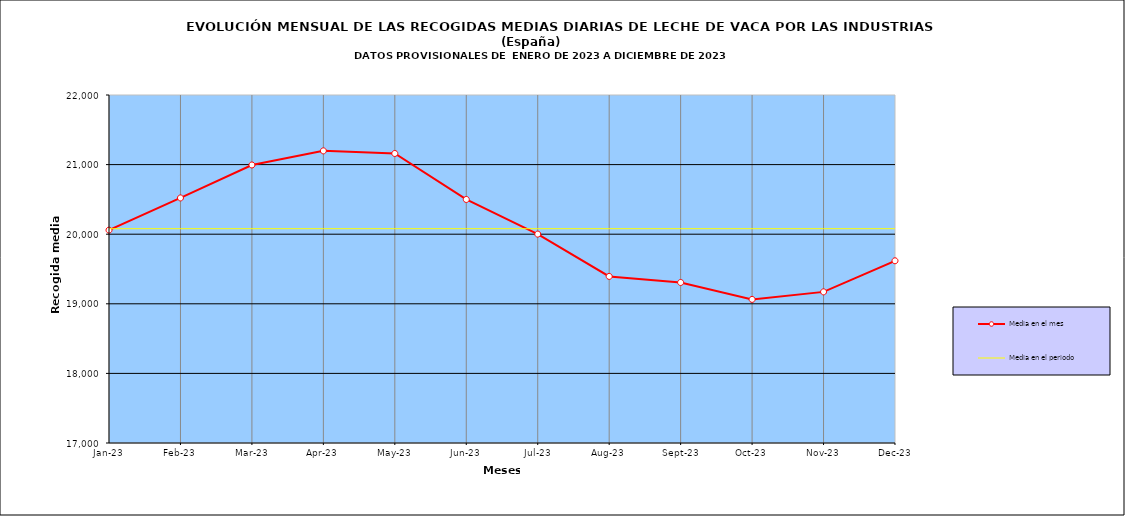
| Category | Media en el mes | Media en el periodo |
|---|---|---|
| 2023-01-01 | 20058.355 | 20078.822 |
| 2023-02-01 | 20521 | 20078.822 |
| 2023-03-01 | 20994.613 | 20078.822 |
| 2023-04-01 | 21197.267 | 20078.822 |
| 2023-05-01 | 21159.71 | 20078.822 |
| 2023-06-01 | 20499.167 | 20078.822 |
| 2023-07-01 | 20001.387 | 20078.822 |
| 2023-08-01 | 19393.581 | 20078.822 |
| 2023-09-01 | 19306.433 | 20078.822 |
| 2023-10-01 | 19063.323 | 20078.822 |
| 2023-11-01 | 19171.367 | 20078.822 |
| 2023-12-01 | 19617.903 | 20078.822 |